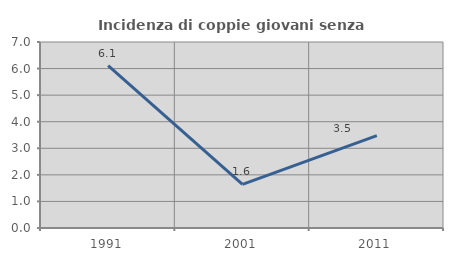
| Category | Incidenza di coppie giovani senza figli |
|---|---|
| 1991.0 | 6.107 |
| 2001.0 | 1.639 |
| 2011.0 | 3.478 |